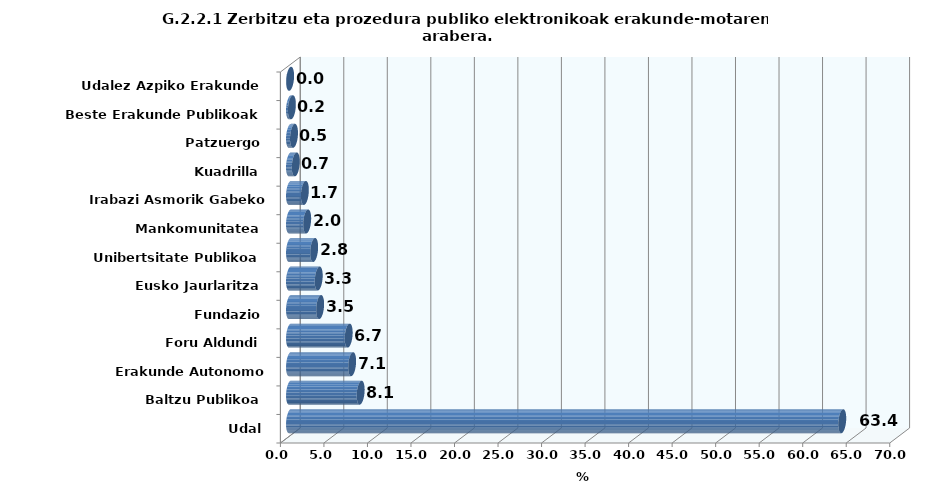
| Category | 2021 |
|---|---|
| Udal | 63.441 |
| Baltzu Publikoa | 8.118 |
| Erakunde Autonomo Administratiboa | 7.137 |
| Foru Aldundi | 6.741 |
| Fundazio | 3.462 |
| Eusko Jaurlaritza | 3.3 |
| Unibertsitate Publikoa | 2.774 |
| Mankomunitatea | 1.973 |
| Irabazi Asmorik Gabeko Erakunde | 1.709 |
| Kuadrilla | 0.665 |
| Patzuergo | 0.461 |
| Beste Erakunde Publikoak | 0.219 |
| Udalez Azpiko Erakunde | 0.015 |